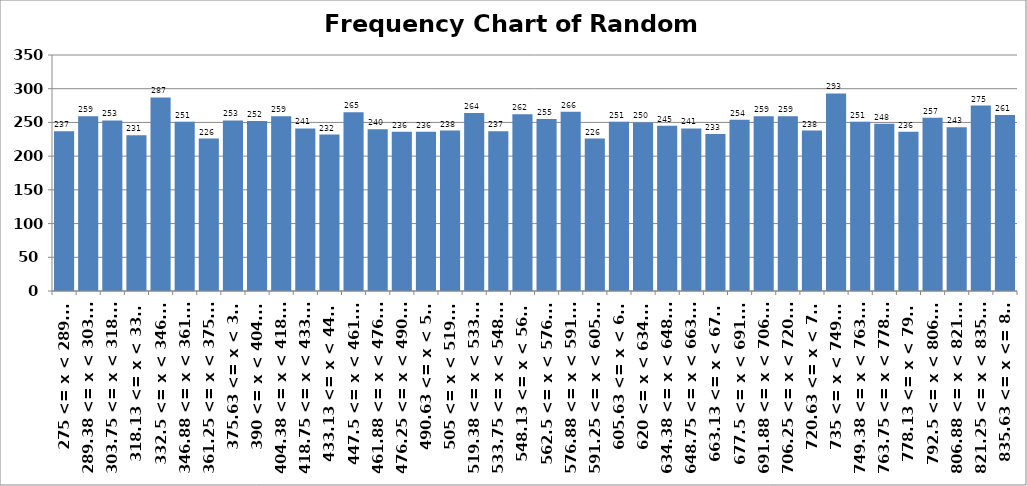
| Category | Series 0 |
|---|---|
| 275 <= x < 289.38 | 237 |
| 289.38 <= x < 303.75 | 259 |
| 303.75 <= x < 318.13 | 253 |
| 318.13 <= x < 332.5 | 231 |
| 332.5 <= x < 346.88 | 287 |
| 346.88 <= x < 361.25 | 251 |
| 361.25 <= x < 375.63 | 226 |
| 375.63 <= x < 390 | 253 |
| 390 <= x < 404.38 | 252 |
| 404.38 <= x < 418.75 | 259 |
| 418.75 <= x < 433.13 | 241 |
| 433.13 <= x < 447.5 | 232 |
| 447.5 <= x < 461.88 | 265 |
| 461.88 <= x < 476.25 | 240 |
| 476.25 <= x < 490.63 | 236 |
| 490.63 <= x < 505 | 236 |
| 505 <= x < 519.38 | 238 |
| 519.38 <= x < 533.75 | 264 |
| 533.75 <= x < 548.13 | 237 |
| 548.13 <= x < 562.5 | 262 |
| 562.5 <= x < 576.88 | 255 |
| 576.88 <= x < 591.25 | 266 |
| 591.25 <= x < 605.63 | 226 |
| 605.63 <= x < 620 | 251 |
| 620 <= x < 634.38 | 250 |
| 634.38 <= x < 648.75 | 245 |
| 648.75 <= x < 663.13 | 241 |
| 663.13 <= x < 677.5 | 233 |
| 677.5 <= x < 691.88 | 254 |
| 691.88 <= x < 706.25 | 259 |
| 706.25 <= x < 720.63 | 259 |
| 720.63 <= x < 735 | 238 |
| 735 <= x < 749.38 | 293 |
| 749.38 <= x < 763.75 | 251 |
| 763.75 <= x < 778.13 | 248 |
| 778.13 <= x < 792.5 | 236 |
| 792.5 <= x < 806.88 | 257 |
| 806.88 <= x < 821.25 | 243 |
| 821.25 <= x < 835.63 | 275 |
| 835.63 <= x <= 850 | 261 |